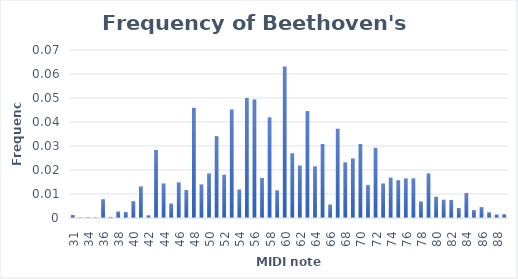
| Category | Series 0 |
|---|---|
| 31.0 | 0.001 |
| 32.0 | 0 |
| 34.0 | 0 |
| 35.0 | 0 |
| 36.0 | 0.008 |
| 37.0 | 0 |
| 38.0 | 0.003 |
| 39.0 | 0.002 |
| 40.0 | 0.007 |
| 41.0 | 0.013 |
| 42.0 | 0.001 |
| 43.0 | 0.028 |
| 44.0 | 0.014 |
| 45.0 | 0.006 |
| 46.0 | 0.015 |
| 47.0 | 0.012 |
| 48.0 | 0.046 |
| 49.0 | 0.014 |
| 50.0 | 0.019 |
| 51.0 | 0.034 |
| 52.0 | 0.018 |
| 53.0 | 0.045 |
| 54.0 | 0.012 |
| 55.0 | 0.05 |
| 56.0 | 0.049 |
| 57.0 | 0.017 |
| 58.0 | 0.042 |
| 59.0 | 0.012 |
| 60.0 | 0.063 |
| 61.0 | 0.027 |
| 62.0 | 0.022 |
| 63.0 | 0.045 |
| 64.0 | 0.022 |
| 65.0 | 0.031 |
| 66.0 | 0.006 |
| 67.0 | 0.037 |
| 68.0 | 0.023 |
| 69.0 | 0.025 |
| 70.0 | 0.031 |
| 71.0 | 0.014 |
| 72.0 | 0.029 |
| 73.0 | 0.014 |
| 74.0 | 0.017 |
| 75.0 | 0.016 |
| 76.0 | 0.016 |
| 77.0 | 0.017 |
| 78.0 | 0.007 |
| 79.0 | 0.019 |
| 80.0 | 0.009 |
| 81.0 | 0.008 |
| 82.0 | 0.007 |
| 83.0 | 0.004 |
| 84.0 | 0.01 |
| 85.0 | 0.003 |
| 86.0 | 0.005 |
| 87.0 | 0.002 |
| 88.0 | 0.001 |
| 89.0 | 0.002 |